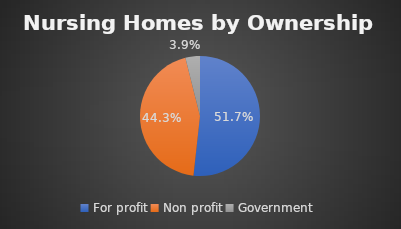
| Category | Series 0 |
|---|---|
| For profit | 0.517 |
| Non profit | 0.443 |
| Government | 0.039 |